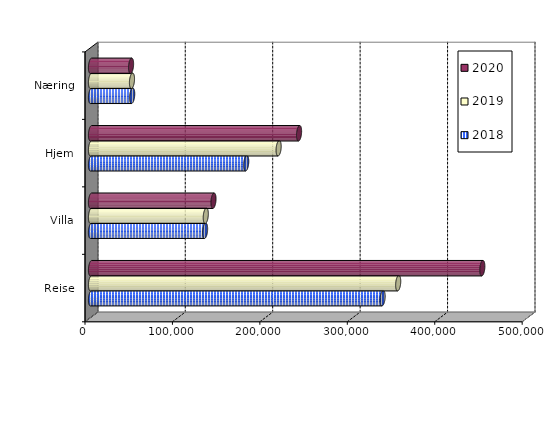
| Category | 2018 | 2019 | 2020 |
|---|---|---|---|
| Reise | 333492 | 351332 | 447542 |
| Villa | 130489.078 | 131285.514 | 140079.526 |
| Hjem | 177509.248 | 214593.359 | 237964 |
| Næring | 47104.097 | 46862.685 | 45810.753 |